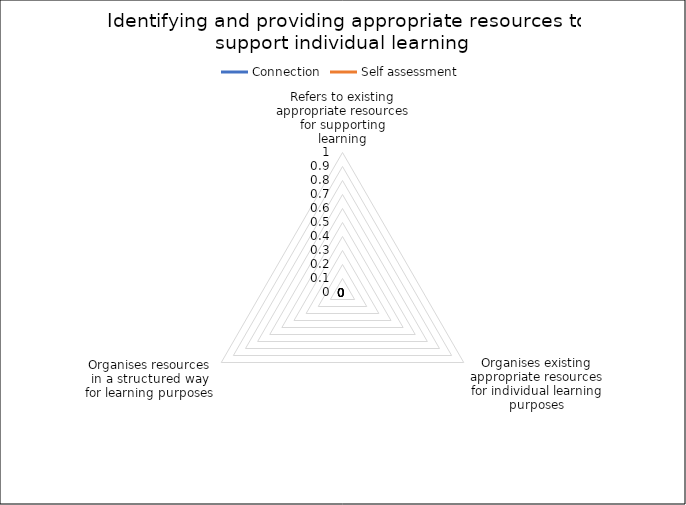
| Category | Connection | Self assessment |
|---|---|---|
| Refers to existing appropriate resources for supporting learning | 0 | 0 |
| Organises existing appropriate resources for individual learning purposes | 0 | 0 |
| Organises resources in a structured way for learning purposes | 0 | 0 |